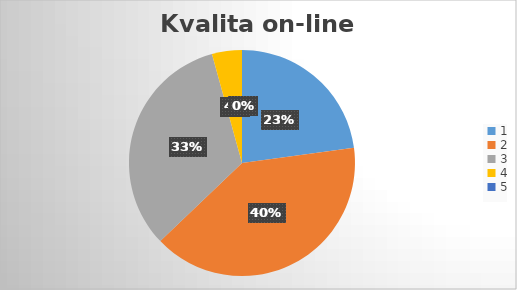
| Category | Series 0 |
|---|---|
| 0 | 16 |
| 1 | 28 |
| 2 | 23 |
| 3 | 3 |
| 4 | 0 |